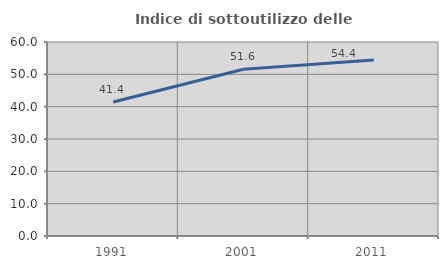
| Category | Indice di sottoutilizzo delle abitazioni  |
|---|---|
| 1991.0 | 41.439 |
| 2001.0 | 51.579 |
| 2011.0 | 54.402 |